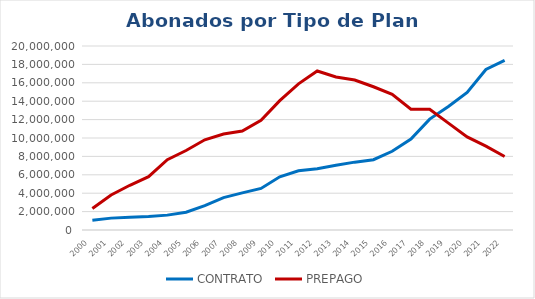
| Category | CONTRATO | PREPAGO |
|---|---|---|
| 2000.0 | 1068130 | 2333395 |
| 2001.0 | 1290852 | 3809931 |
| 2002.0 | 1382871 | 4861439 |
| 2003.0 | 1473310 | 5794971 |
| 2004.0 | 1616653 | 7644732 |
| 2005.0 | 1931459 | 8638113 |
| 2006.0 | 2644224 | 9806577 |
| 2007.0 | 3523166 | 10432036 |
| 2008.0 | 4033678 | 10762915 |
| 2009.0 | 4517200 | 11933023 |
| 2010.0 | 5786405 | 14065837 |
| 2011.0 | 6429681 | 15885567 |
| 2012.0 | 6657716 | 17283257 |
| 2013.0 | 7031350 | 16629989 |
| 2014.0 | 7375577 | 16305141 |
| 2015.0 | 7638385 | 15567968 |
| 2016.0 | 8556131 | 14746472 |
| 2017.0 | 9878035 | 13135112 |
| 2018.0 | 12051532 | 13127449 |
| 2019.0 | 13431953 | 11619715 |
| 2020.0 | 14943390 | 10124859 |
| 2021.0 | 17450637 | 9121186 |
| 2022.0 | 18431373 | 7987571 |